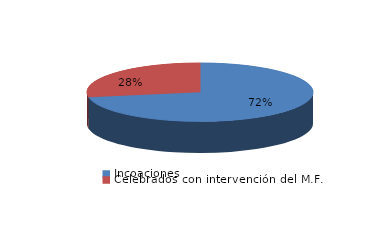
| Category | Series 0 |
|---|---|
| Incoaciones | 534 |
| Celebrados con intervención del M.F. | 206 |